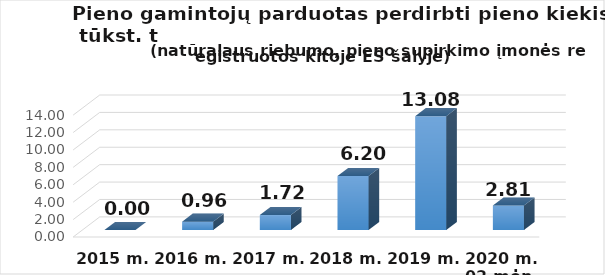
| Category | Kitoje ES šalyje registruotam ūkio subjektui  |
|---|---|
| 2015 m. | 0 |
| 2016 m. | 0.96 |
| 2017 m.  | 1.72 |
| 2018 m.  | 6.2 |
| 2019 m.  | 13.08 |
| 2020 m. 02 mėn. | 2.81 |